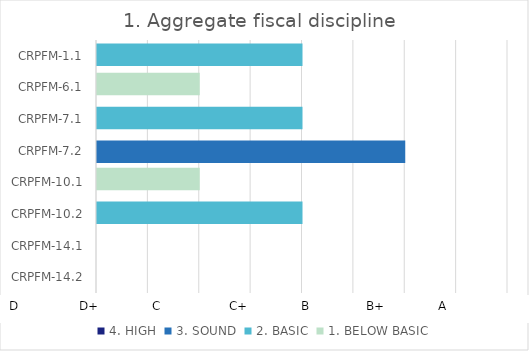
| Category | 4. HIGH | 3. SOUND | 2. BASIC | 1. BELOW BASIC |
|---|---|---|---|---|
| CRPFM-14.2 | 0 | 0 | 0 | 0 |
| CRPFM-14.1 | 0 | 0 | 0 | 0 |
| CRPFM-10.2 | 0 | 0 | 2 | 0 |
| CRPFM-10.1 | 0 | 0 | 0 | 1 |
| CRPFM-7.2 | 0 | 3 | 0 | 0 |
| CRPFM-7.1 | 0 | 0 | 2 | 0 |
| CRPFM-6.1 | 0 | 0 | 0 | 1 |
| CRPFM-1.1 | 0 | 0 | 2 | 0 |